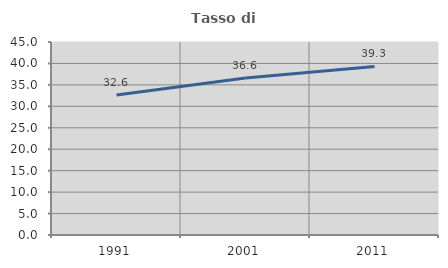
| Category | Tasso di occupazione   |
|---|---|
| 1991.0 | 32.633 |
| 2001.0 | 36.613 |
| 2011.0 | 39.289 |